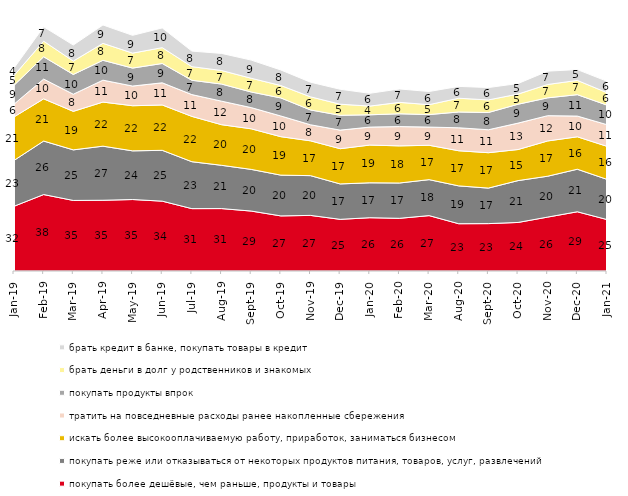
| Category | покупать более дешёвые, чем раньше, продукты и товары | покупать реже или отказываться от некоторых продуктов питания, товаров, услуг, развлечений | искать более высокооплачиваемую работу, приработок, заниматься бизнесом | тратить на повседневные расходы ранее накопленные сбережения | покупать продукты впрок | брать деньги в долг у родственников и знакомых | брать кредит в банке, покупать товары в кредит |
|---|---|---|---|---|---|---|---|
| 2019-01-01 | 31.75 | 22.5 | 21.35 | 6.25 | 9.25 | 4.8 | 3.65 |
| 2019-02-01 | 37.5 | 26.25 | 20.7 | 9.7 | 10.95 | 7.65 | 7.05 |
| 2019-03-01 | 34.61 | 24.814 | 18.896 | 8.404 | 9.697 | 6.564 | 7.857 |
| 2019-04-01 | 34.703 | 26.535 | 21.634 | 10.743 | 9.752 | 8.317 | 9.01 |
| 2019-05-01 | 35.067 | 23.873 | 22.14 | 9.658 | 8.816 | 7.33 | 8.717 |
| 2019-06-01 | 34.264 | 24.938 | 22.244 | 10.873 | 9.476 | 7.781 | 9.676 |
| 2019-07-01 | 30.594 | 23.02 | 22.228 | 10.693 | 7.03 | 6.683 | 7.624 |
| 2019-08-01 | 30.619 | 21.229 | 19.93 | 11.538 | 8.392 | 6.643 | 8.392 |
| 2019-09-01 | 29.406 | 20.446 | 19.901 | 10.396 | 7.673 | 6.733 | 8.911 |
| 2019-10-01 | 27.03 | 20 | 18.861 | 10.149 | 8.861 | 6.089 | 7.624 |
| 2019-11-01 | 27.277 | 19.505 | 17.079 | 7.871 | 7.277 | 6.436 | 7.178 |
| 2019-12-01 | 25.347 | 17.376 | 17.277 | 9.109 | 7.277 | 5.446 | 7.327 |
| 2020-01-01 | 26.139 | 17.129 | 18.515 | 8.812 | 6.04 | 4.257 | 6.287 |
| 2020-02-01 | 25.842 | 17.327 | 18.218 | 9.455 | 6.287 | 5.594 | 6.584 |
| 2020-03-01 | 27.169 | 17.65 | 16.857 | 8.924 | 6.148 | 4.859 | 6.445 |
| 2020-08-01 | 23.188 | 18.57 | 17.229 | 11.271 | 7.746 | 6.753 | 5.809 |
| 2020-09-01 | 23.245 | 17.422 | 17.372 | 11.249 | 8.462 | 6.172 | 6.073 |
| 2020-10-01 | 23.817 | 20.528 | 15.247 | 12.955 | 9.268 | 4.983 | 5.182 |
| 2020-11-01 | 26.45 | 20.05 | 17.3 | 12.4 | 8.75 | 6.55 | 6.55 |
| 2020-12-01 | 29.053 | 20.873 | 15.915 | 10.164 | 10.511 | 6.991 | 5.305 |
| 2021-01-01 | 25.236 | 19.722 | 16.195 | 10.631 | 9.588 | 6.11 | 5.614 |